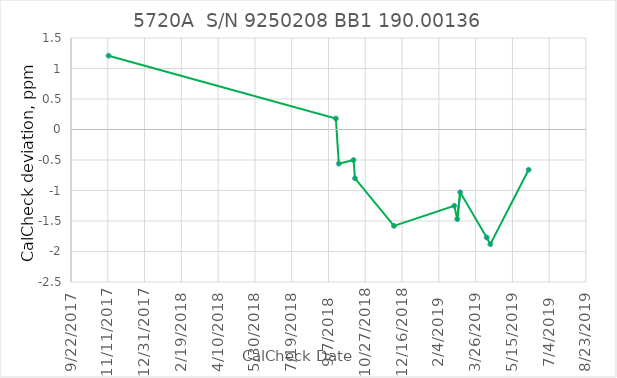
| Category | Series 0 |
|---|---|
| 43051.0 | 1.21 |
| 43360.0 | 0.18 |
| 43364.0 | -0.56 |
| 43384.0 | -0.5 |
| 43386.0 | -0.8 |
| 43439.0 | -1.58 |
| 43521.0 | -1.25 |
| 43525.0 | -1.47 |
| 43529.0 | -1.03 |
| 43565.0 | -1.77 |
| 43570.0 | -1.88 |
| 43622.0 | -0.66 |